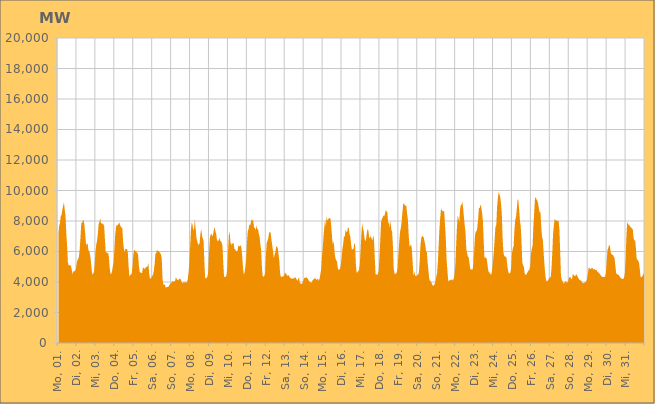
| Category | Series 0 |
|---|---|
|  Mo, 01.  | 7160.8 |
|  Mo, 01.  | 7705.218 |
|  Mo, 01.  | 7864.699 |
|  Mo, 01.  | 8328.516 |
|  Mo, 01.  | 8390.173 |
|  Mo, 01.  | 8753.918 |
|  Mo, 01.  | 8996.663 |
|  Mo, 01.  | 9224.132 |
|  Mo, 01.  | 8751.63 |
|  Mo, 01.  | 8347.011 |
|  Mo, 01.  | 7218.068 |
|  Mo, 01.  | 6396.392 |
|  Mo, 01.  | 5312.818 |
|  Mo, 01.  | 5092.311 |
|  Mo, 01.  | 5100.674 |
|  Mo, 01.  | 5104.183 |
|  Mo, 01.  | 5050.026 |
|  Di, 02.  | 4777.491 |
|  Di, 02.  | 4504.343 |
|  Di, 02.  | 4703.73 |
|  Di, 02.  | 4683.091 |
|  Di, 02.  | 4751.146 |
|  Di, 02.  | 4800.699 |
|  Di, 02.  | 5169.973 |
|  Di, 02.  | 5424.805 |
|  Di, 02.  | 5495.186 |
|  Di, 02.  | 5653.998 |
|  Di, 02.  | 6155.003 |
|  Di, 02.  | 6919.252 |
|  Di, 02.  | 7878.823 |
|  Di, 02.  | 7863.462 |
|  Di, 02.  | 8044.74 |
|  Di, 02.  | 8046.723 |
|  Di, 02.  | 7725.12 |
|  Di, 02.  | 7157.747 |
|  Di, 02.  | 6465.687 |
|  Di, 02.  | 6462.276 |
|  Di, 02.  | 6552.212 |
|  Di, 02.  | 6120.136 |
|  Di, 02.  | 6020.143 |
|  Di, 02.  | 5851.743 |
|  Mi, 03.  | 5464.788 |
|  Mi, 03.  | 4869.98 |
|  Mi, 03.  | 4470.95 |
|  Mi, 03.  | 4552.139 |
|  Mi, 03.  | 4636.698 |
|  Mi, 03.  | 5122.081 |
|  Mi, 03.  | 6000.724 |
|  Mi, 03.  | 6456.434 |
|  Mi, 03.  | 6697.356 |
|  Mi, 03.  | 7150.811 |
|  Mi, 03.  | 7785.971 |
|  Mi, 03.  | 7944.531 |
|  Mi, 03.  | 8176.038 |
|  Mi, 03.  | 7851.384 |
|  Mi, 03.  | 7831.848 |
|  Mi, 03.  | 7835.501 |
|  Mi, 03.  | 7790.822 |
|  Mi, 03.  | 7666.782 |
|  Mi, 03.  | 6763.971 |
|  Mi, 03.  | 5929.706 |
|  Mi, 03.  | 5962.51 |
|  Mi, 03.  | 5880.363 |
|  Mi, 03.  | 5910.435 |
|  Mi, 03.  | 5634.178 |
|  Do, 04.  | 4930.859 |
|  Do, 04.  | 4541.599 |
|  Do, 04.  | 4517.017 |
|  Do, 04.  | 4700.879 |
|  Do, 04.  | 5041.495 |
|  Do, 04.  | 5295.906 |
|  Do, 04.  | 6176.422 |
|  Do, 04.  | 7097.032 |
|  Do, 04.  | 7595.268 |
|  Do, 04.  | 7761.839 |
|  Do, 04.  | 7701.492 |
|  Do, 04.  | 7794.035 |
|  Do, 04.  | 7913.431 |
|  Do, 04.  | 7751.925 |
|  Do, 04.  | 7645.281 |
|  Do, 04.  | 7557.731 |
|  Do, 04.  | 7570.642 |
|  Do, 04.  | 6646.405 |
|  Do, 04.  | 6188.732 |
|  Do, 04.  | 5933.102 |
|  Do, 04.  | 6183.347 |
|  Do, 04.  | 6147.994 |
|  Do, 04.  | 6172.458 |
|  Do, 04.  | 5937.749 |
|  Fr, 05.  | 4988.127 |
|  Fr, 05.  | 4360.904 |
|  Fr, 05.  | 4465.97 |
|  Fr, 05.  | 4481.926 |
|  Fr, 05.  | 4576.888 |
|  Fr, 05.  | 5017.709 |
|  Fr, 05.  | 5780.562 |
|  Fr, 05.  | 6108.178 |
|  Fr, 05.  | 6061.314 |
|  Fr, 05.  | 6012.59 |
|  Fr, 05.  | 5953.136 |
|  Fr, 05.  | 5906.494 |
|  Fr, 05.  | 5795.051 |
|  Fr, 05.  | 5092.796 |
|  Fr, 05.  | 4671.377 |
|  Fr, 05.  | 4619.644 |
|  Fr, 05.  | 4610.367 |
|  Fr, 05.  | 4565.465 |
|  Fr, 05.  | 4901.234 |
|  Fr, 05.  | 4954.916 |
|  Fr, 05.  | 4870.929 |
|  Fr, 05.  | 4875.349 |
|  Fr, 05.  | 4973.858 |
|  Fr, 05.  | 4985.63 |
|  Sa, 06.  | 5033.617 |
|  Sa, 06.  | 5246.087 |
|  Sa, 06.  | 4592.596 |
|  Sa, 06.  | 4229.398 |
|  Sa, 06.  | 4229.584 |
|  Sa, 06.  | 4299.787 |
|  Sa, 06.  | 4399.803 |
|  Sa, 06.  | 4488.37 |
|  Sa, 06.  | 4751.216 |
|  Sa, 06.  | 5198.847 |
|  Sa, 06.  | 5871.813 |
|  Sa, 06.  | 5891.169 |
|  Sa, 06.  | 6134.83 |
|  Sa, 06.  | 6011.156 |
|  Sa, 06.  | 6014.912 |
|  Sa, 06.  | 5979.808 |
|  Sa, 06.  | 5873.295 |
|  Sa, 06.  | 5823.883 |
|  Sa, 06.  | 5523.351 |
|  Sa, 06.  | 4207.687 |
|  Sa, 06.  | 3823.684 |
|  Sa, 06.  | 3838.857 |
|  Sa, 06.  | 3818.794 |
|  Sa, 06.  | 3625.022 |
|  So, 07.  | 3658.255 |
|  So, 07.  | 3669.756 |
|  So, 07.  | 3668.924 |
|  So, 07.  | 3726.962 |
|  So, 07.  | 3833.741 |
|  So, 07.  | 3889.55 |
|  So, 07.  | 3947.685 |
|  So, 07.  | 3994.545 |
|  So, 07.  | 4077.124 |
|  So, 07.  | 4025.181 |
|  So, 07.  | 4017.348 |
|  So, 07.  | 4094.382 |
|  So, 07.  | 4326.647 |
|  So, 07.  | 4192.877 |
|  So, 07.  | 4140.207 |
|  So, 07.  | 4104.201 |
|  So, 07.  | 4232.823 |
|  So, 07.  | 4202.677 |
|  So, 07.  | 4177.596 |
|  So, 07.  | 4049.653 |
|  So, 07.  | 3909.823 |
|  So, 07.  | 3979.445 |
|  So, 07.  | 3973.53 |
|  So, 07.  | 3980.216 |
|  Mo, 08.  | 3975.462 |
|  Mo, 08.  | 3952.562 |
|  Mo, 08.  | 4001.577 |
|  Mo, 08.  | 4192.479 |
|  Mo, 08.  | 4620.058 |
|  Mo, 08.  | 5312.887 |
|  Mo, 08.  | 6309.76 |
|  Mo, 08.  | 7429.641 |
|  Mo, 08.  | 7911.313 |
|  Mo, 08.  | 7761.518 |
|  Mo, 08.  | 7375.69 |
|  Mo, 08.  | 7550.807 |
|  Mo, 08.  | 8101.582 |
|  Mo, 08.  | 7475.265 |
|  Mo, 08.  | 6879.427 |
|  Mo, 08.  | 6673.732 |
|  Mo, 08.  | 6488.745 |
|  Mo, 08.  | 6434.608 |
|  Mo, 08.  | 6575.351 |
|  Mo, 08.  | 7169.19 |
|  Mo, 08.  | 7463.065 |
|  Mo, 08.  | 7049.424 |
|  Mo, 08.  | 6838.778 |
|  Mo, 08.  | 6739.852 |
|  Di, 09.  | 5309.416 |
|  Di, 09.  | 4275.985 |
|  Di, 09.  | 4215.956 |
|  Di, 09.  | 4292.653 |
|  Di, 09.  | 4362.668 |
|  Di, 09.  | 4747.168 |
|  Di, 09.  | 6010.226 |
|  Di, 09.  | 6872.619 |
|  Di, 09.  | 7128.411 |
|  Di, 09.  | 7162.15 |
|  Di, 09.  | 6986.376 |
|  Di, 09.  | 7110.528 |
|  Di, 09.  | 7395.117 |
|  Di, 09.  | 7593.925 |
|  Di, 09.  | 7336.824 |
|  Di, 09.  | 7141.814 |
|  Di, 09.  | 6751.124 |
|  Di, 09.  | 6680.317 |
|  Di, 09.  | 6712.713 |
|  Di, 09.  | 6917.112 |
|  Di, 09.  | 6711.591 |
|  Di, 09.  | 6662.535 |
|  Di, 09.  | 6582.888 |
|  Di, 09.  | 6354.857 |
|  Mi, 10.  | 5212.211 |
|  Mi, 10.  | 4318.948 |
|  Mi, 10.  | 4352.289 |
|  Mi, 10.  | 4347.541 |
|  Mi, 10.  | 4414.83 |
|  Mi, 10.  | 4894.443 |
|  Mi, 10.  | 5985.324 |
|  Mi, 10.  | 7042.466 |
|  Mi, 10.  | 7315.863 |
|  Mi, 10.  | 6634.918 |
|  Mi, 10.  | 6387.175 |
|  Mi, 10.  | 6581.41 |
|  Mi, 10.  | 6483.927 |
|  Mi, 10.  | 6586.209 |
|  Mi, 10.  | 6186.66 |
|  Mi, 10.  | 6143.909 |
|  Mi, 10.  | 6038.358 |
|  Mi, 10.  | 5996.383 |
|  Mi, 10.  | 6038.663 |
|  Mi, 10.  | 6409.104 |
|  Mi, 10.  | 6321.779 |
|  Mi, 10.  | 6364.27 |
|  Mi, 10.  | 6407.552 |
|  Mi, 10.  | 6238.225 |
|  Do, 11.  | 5678.478 |
|  Do, 11.  | 4939.174 |
|  Do, 11.  | 4486.344 |
|  Do, 11.  | 4616.661 |
|  Do, 11.  | 4985.549 |
|  Do, 11.  | 5569.904 |
|  Do, 11.  | 6553.877 |
|  Do, 11.  | 7331.064 |
|  Do, 11.  | 7452.473 |
|  Do, 11.  | 7778.124 |
|  Do, 11.  | 7712.094 |
|  Do, 11.  | 7911.382 |
|  Do, 11.  | 8116.081 |
|  Do, 11.  | 8059.647 |
|  Do, 11.  | 8019.377 |
|  Do, 11.  | 7557.197 |
|  Do, 11.  | 7551.771 |
|  Do, 11.  | 7395.552 |
|  Do, 11.  | 7725.649 |
|  Do, 11.  | 7439.542 |
|  Do, 11.  | 7522.095 |
|  Do, 11.  | 7161.052 |
|  Do, 11.  | 6971.345 |
|  Do, 11.  | 6452.594 |
|  Fr, 12.  | 6098.247 |
|  Fr, 12.  | 4928.394 |
|  Fr, 12.  | 4367.582 |
|  Fr, 12.  | 4352.858 |
|  Fr, 12.  | 4395.655 |
|  Fr, 12.  | 4605.897 |
|  Fr, 12.  | 5732.389 |
|  Fr, 12.  | 6563.914 |
|  Fr, 12.  | 6703.312 |
|  Fr, 12.  | 6860.232 |
|  Fr, 12.  | 7198.927 |
|  Fr, 12.  | 7319.134 |
|  Fr, 12.  | 7218.802 |
|  Fr, 12.  | 6775.13 |
|  Fr, 12.  | 6416.905 |
|  Fr, 12.  | 6042.671 |
|  Fr, 12.  | 5567.392 |
|  Fr, 12.  | 5786.575 |
|  Fr, 12.  | 5942.776 |
|  Fr, 12.  | 6324.396 |
|  Fr, 12.  | 6333.633 |
|  Fr, 12.  | 6214.995 |
|  Fr, 12.  | 5822.454 |
|  Fr, 12.  | 5395.099 |
|  Sa, 13.  | 4585.87 |
|  Sa, 13.  | 4335.458 |
|  Sa, 13.  | 4348.648 |
|  Sa, 13.  | 4360.104 |
|  Sa, 13.  | 4361.477 |
|  Sa, 13.  | 4412.052 |
|  Sa, 13.  | 4605.565 |
|  Sa, 13.  | 4568.092 |
|  Sa, 13.  | 4524.814 |
|  Sa, 13.  | 4371.555 |
|  Sa, 13.  | 4490.72 |
|  Sa, 13.  | 4418.519 |
|  Sa, 13.  | 4328.934 |
|  Sa, 13.  | 4264.462 |
|  Sa, 13.  | 4227.888 |
|  Sa, 13.  | 4227.896 |
|  Sa, 13.  | 4214.992 |
|  Sa, 13.  | 4246.714 |
|  Sa, 13.  | 4232.562 |
|  Sa, 13.  | 4326.769 |
|  Sa, 13.  | 4256.079 |
|  Sa, 13.  | 4166.355 |
|  Sa, 13.  | 4075.748 |
|  Sa, 13.  | 4206.025 |
|  So, 14.  | 4320.998 |
|  So, 14.  | 3912.711 |
|  So, 14.  | 3916.619 |
|  So, 14.  | 3869.18 |
|  So, 14.  | 3885.857 |
|  So, 14.  | 4032.226 |
|  So, 14.  | 4192.672 |
|  So, 14.  | 4275.719 |
|  So, 14.  | 4270.021 |
|  So, 14.  | 4308.577 |
|  So, 14.  | 4286.086 |
|  So, 14.  | 4202.992 |
|  So, 14.  | 4136.777 |
|  So, 14.  | 4031.028 |
|  So, 14.  | 4001.459 |
|  So, 14.  | 3962.437 |
|  So, 14.  | 3961.829 |
|  So, 14.  | 4093.948 |
|  So, 14.  | 4155.546 |
|  So, 14.  | 4192.963 |
|  So, 14.  | 4265.455 |
|  So, 14.  | 4209.593 |
|  So, 14.  | 4140.869 |
|  So, 14.  | 4178.077 |
|  Mo, 15.  | 4215.054 |
|  Mo, 15.  | 4082.978 |
|  Mo, 15.  | 4211.104 |
|  Mo, 15.  | 4508.053 |
|  Mo, 15.  | 4826.199 |
|  Mo, 15.  | 5677.585 |
|  Mo, 15.  | 6200.498 |
|  Mo, 15.  | 6949.018 |
|  Mo, 15.  | 7573.647 |
|  Mo, 15.  | 8103.706 |
|  Mo, 15.  | 7645.308 |
|  Mo, 15.  | 8300.122 |
|  Mo, 15.  | 8041.005 |
|  Mo, 15.  | 8104.88 |
|  Mo, 15.  | 8196.719 |
|  Mo, 15.  | 8189.322 |
|  Mo, 15.  | 8132.924 |
|  Mo, 15.  | 7562.423 |
|  Mo, 15.  | 6815.567 |
|  Mo, 15.  | 6430.644 |
|  Mo, 15.  | 6699.538 |
|  Mo, 15.  | 5963.449 |
|  Mo, 15.  | 5595.028 |
|  Mo, 15.  | 5431.043 |
|  Di, 16.  | 5362.591 |
|  Di, 16.  | 4948.988 |
|  Di, 16.  | 4792.878 |
|  Di, 16.  | 4798.367 |
|  Di, 16.  | 4877.418 |
|  Di, 16.  | 5155.493 |
|  Di, 16.  | 5576.57 |
|  Di, 16.  | 6182.215 |
|  Di, 16.  | 6512.719 |
|  Di, 16.  | 7025.106 |
|  Di, 16.  | 6943.917 |
|  Di, 16.  | 7437.91 |
|  Di, 16.  | 7301.562 |
|  Di, 16.  | 7272.911 |
|  Di, 16.  | 7578.987 |
|  Di, 16.  | 7544.44 |
|  Di, 16.  | 7137.191 |
|  Di, 16.  | 6988.367 |
|  Di, 16.  | 6464.423 |
|  Di, 16.  | 6130.749 |
|  Di, 16.  | 6148.115 |
|  Di, 16.  | 6138.44 |
|  Di, 16.  | 6546.124 |
|  Di, 16.  | 6481.737 |
|  Mi, 17.  | 5211.827 |
|  Mi, 17.  | 4600.015 |
|  Mi, 17.  | 4649.496 |
|  Mi, 17.  | 4705.835 |
|  Mi, 17.  | 4794.142 |
|  Mi, 17.  | 5114.392 |
|  Mi, 17.  | 6055.257 |
|  Mi, 17.  | 7086.213 |
|  Mi, 17.  | 7858.074 |
|  Mi, 17.  | 7526.629 |
|  Mi, 17.  | 7336.363 |
|  Mi, 17.  | 6859.058 |
|  Mi, 17.  | 6654.554 |
|  Mi, 17.  | 6806.201 |
|  Mi, 17.  | 7256.578 |
|  Mi, 17.  | 7480.425 |
|  Mi, 17.  | 7344.464 |
|  Mi, 17.  | 6875.962 |
|  Mi, 17.  | 6905.876 |
|  Mi, 17.  | 7040.421 |
|  Mi, 17.  | 6821.933 |
|  Mi, 17.  | 6723.819 |
|  Mi, 17.  | 7049.082 |
|  Mi, 17.  | 6820.25 |
|  Do, 18.  | 5563.418 |
|  Do, 18.  | 4516.212 |
|  Do, 18.  | 4499.607 |
|  Do, 18.  | 4463.201 |
|  Do, 18.  | 4542.612 |
|  Do, 18.  | 4759.906 |
|  Do, 18.  | 5652.83 |
|  Do, 18.  | 6785.527 |
|  Do, 18.  | 7935.247 |
|  Do, 18.  | 8124.386 |
|  Do, 18.  | 8237.584 |
|  Do, 18.  | 8371.242 |
|  Do, 18.  | 8301.173 |
|  Do, 18.  | 8506.185 |
|  Do, 18.  | 8719.286 |
|  Do, 18.  | 8620.096 |
|  Do, 18.  | 8578.305 |
|  Do, 18.  | 7779.26 |
|  Do, 18.  | 7989.325 |
|  Do, 18.  | 7530.381 |
|  Do, 18.  | 8023.606 |
|  Do, 18.  | 7437.495 |
|  Do, 18.  | 7300.115 |
|  Do, 18.  | 6347.056 |
|  Fr, 19.  | 4868.461 |
|  Fr, 19.  | 4561.302 |
|  Fr, 19.  | 4508.758 |
|  Fr, 19.  | 4541.535 |
|  Fr, 19.  | 4651.283 |
|  Fr, 19.  | 4960.966 |
|  Fr, 19.  | 5865.576 |
|  Fr, 19.  | 6625.546 |
|  Fr, 19.  | 7282.585 |
|  Fr, 19.  | 7539.443 |
|  Fr, 19.  | 7927.691 |
|  Fr, 19.  | 8540.51 |
|  Fr, 19.  | 9090.552 |
|  Fr, 19.  | 9180.535 |
|  Fr, 19.  | 9025.452 |
|  Fr, 19.  | 9012.91 |
|  Fr, 19.  | 8973.731 |
|  Fr, 19.  | 8468.399 |
|  Fr, 19.  | 8066.463 |
|  Fr, 19.  | 7081.638 |
|  Fr, 19.  | 6311.709 |
|  Fr, 19.  | 6378.722 |
|  Fr, 19.  | 6482.381 |
|  Fr, 19.  | 6149.943 |
|  Sa, 20.  | 5292.29 |
|  Sa, 20.  | 4398.727 |
|  Sa, 20.  | 4676.804 |
|  Sa, 20.  | 4463.127 |
|  Sa, 20.  | 4371.954 |
|  Sa, 20.  | 4388.974 |
|  Sa, 20.  | 4465.704 |
|  Sa, 20.  | 4473.273 |
|  Sa, 20.  | 4636.656 |
|  Sa, 20.  | 5455.432 |
|  Sa, 20.  | 6500.528 |
|  Sa, 20.  | 6876.181 |
|  Sa, 20.  | 7040.547 |
|  Sa, 20.  | 6974.064 |
|  Sa, 20.  | 6938.793 |
|  Sa, 20.  | 6669.769 |
|  Sa, 20.  | 6441.555 |
|  Sa, 20.  | 5987.808 |
|  Sa, 20.  | 5971.031 |
|  Sa, 20.  | 5277.205 |
|  Sa, 20.  | 4768.933 |
|  Sa, 20.  | 4197.201 |
|  Sa, 20.  | 4082.464 |
|  Sa, 20.  | 4030.803 |
|  So, 21.  | 3942.199 |
|  So, 21.  | 3807.881 |
|  So, 21.  | 3746.136 |
|  So, 21.  | 3790.441 |
|  So, 21.  | 3878.605 |
|  So, 21.  | 4056.882 |
|  So, 21.  | 4347.4 |
|  So, 21.  | 4585.754 |
|  So, 21.  | 5349.194 |
|  So, 21.  | 6427.62 |
|  So, 21.  | 7539.536 |
|  So, 21.  | 8239.715 |
|  So, 21.  | 8823.966 |
|  So, 21.  | 8704.238 |
|  So, 21.  | 8645.056 |
|  So, 21.  | 8654.894 |
|  So, 21.  | 8621.313 |
|  So, 21.  | 7758.486 |
|  So, 21.  | 6878.914 |
|  So, 21.  | 5500.284 |
|  So, 21.  | 4776.17 |
|  So, 21.  | 4139.242 |
|  So, 21.  | 4018.17 |
|  So, 21.  | 4119.638 |
|  Mo, 22.  | 4138.452 |
|  Mo, 22.  | 4134.599 |
|  Mo, 22.  | 4187.487 |
|  Mo, 22.  | 4076.793 |
|  Mo, 22.  | 4212.051 |
|  Mo, 22.  | 4475.846 |
|  Mo, 22.  | 5026.713 |
|  Mo, 22.  | 6219.034 |
|  Mo, 22.  | 7435.846 |
|  Mo, 22.  | 8316.531 |
|  Mo, 22.  | 8217.617 |
|  Mo, 22.  | 7916.777 |
|  Mo, 22.  | 8691.771 |
|  Mo, 22.  | 9040.911 |
|  Mo, 22.  | 9069.226 |
|  Mo, 22.  | 9261.955 |
|  Mo, 22.  | 8843.47 |
|  Mo, 22.  | 8253.871 |
|  Mo, 22.  | 7709.99 |
|  Mo, 22.  | 7278.463 |
|  Mo, 22.  | 6185.423 |
|  Mo, 22.  | 5874.856 |
|  Mo, 22.  | 5675.357 |
|  Mo, 22.  | 5621.787 |
|  Di, 23.  | 5252.877 |
|  Di, 23.  | 4858.763 |
|  Di, 23.  | 4817.873 |
|  Di, 23.  | 4815.362 |
|  Di, 23.  | 4822.172 |
|  Di, 23.  | 5206.875 |
|  Di, 23.  | 6063.493 |
|  Di, 23.  | 7041.484 |
|  Di, 23.  | 7300.89 |
|  Di, 23.  | 7322.907 |
|  Di, 23.  | 7587.876 |
|  Di, 23.  | 8125.929 |
|  Di, 23.  | 8862.984 |
|  Di, 23.  | 8844.649 |
|  Di, 23.  | 9075.928 |
|  Di, 23.  | 8913.657 |
|  Di, 23.  | 8534.375 |
|  Di, 23.  | 8029.427 |
|  Di, 23.  | 6770.636 |
|  Di, 23.  | 5583.033 |
|  Di, 23.  | 5594.322 |
|  Di, 23.  | 5613.94 |
|  Di, 23.  | 5489.226 |
|  Di, 23.  | 5056.18 |
|  Mi, 24.  | 4702.673 |
|  Mi, 24.  | 4636.539 |
|  Mi, 24.  | 4551.055 |
|  Mi, 24.  | 4496.52 |
|  Mi, 24.  | 4510.786 |
|  Mi, 24.  | 4903.762 |
|  Mi, 24.  | 5455.482 |
|  Mi, 24.  | 6064.787 |
|  Mi, 24.  | 6856.741 |
|  Mi, 24.  | 7654.946 |
|  Mi, 24.  | 7693.344 |
|  Mi, 24.  | 8905.487 |
|  Mi, 24.  | 9484.893 |
|  Mi, 24.  | 9885.241 |
|  Mi, 24.  | 9768.291 |
|  Mi, 24.  | 9573.295 |
|  Mi, 24.  | 9133.405 |
|  Mi, 24.  | 8507.067 |
|  Mi, 24.  | 6926.606 |
|  Mi, 24.  | 5969.53 |
|  Mi, 24.  | 5718.175 |
|  Mi, 24.  | 5661.456 |
|  Mi, 24.  | 5666.157 |
|  Mi, 24.  | 5576.255 |
|  Do, 25.  | 5062.665 |
|  Do, 25.  | 4739.975 |
|  Do, 25.  | 4556.046 |
|  Do, 25.  | 4577.871 |
|  Do, 25.  | 4629.501 |
|  Do, 25.  | 5006.083 |
|  Do, 25.  | 5925.83 |
|  Do, 25.  | 6205.438 |
|  Do, 25.  | 6355.858 |
|  Do, 25.  | 7403.859 |
|  Do, 25.  | 8069.812 |
|  Do, 25.  | 8249.682 |
|  Do, 25.  | 8780.768 |
|  Do, 25.  | 9430.347 |
|  Do, 25.  | 9342.992 |
|  Do, 25.  | 8746.193 |
|  Do, 25.  | 8010.639 |
|  Do, 25.  | 7647.146 |
|  Do, 25.  | 6627.037 |
|  Do, 25.  | 5268.278 |
|  Do, 25.  | 5094.515 |
|  Do, 25.  | 4986.092 |
|  Do, 25.  | 4563.694 |
|  Do, 25.  | 4468.327 |
|  Fr, 26.  | 4482.504 |
|  Fr, 26.  | 4580.426 |
|  Fr, 26.  | 4670.487 |
|  Fr, 26.  | 4764.926 |
|  Fr, 26.  | 4802.963 |
|  Fr, 26.  | 5044.897 |
|  Fr, 26.  | 5836.627 |
|  Fr, 26.  | 6195.007 |
|  Fr, 26.  | 6352.713 |
|  Fr, 26.  | 7611.755 |
|  Fr, 26.  | 8506.262 |
|  Fr, 26.  | 9456.294 |
|  Fr, 26.  | 9577.388 |
|  Fr, 26.  | 9406.465 |
|  Fr, 26.  | 9349.907 |
|  Fr, 26.  | 9164.299 |
|  Fr, 26.  | 8812.498 |
|  Fr, 26.  | 8545.847 |
|  Fr, 26.  | 8620.7 |
|  Fr, 26.  | 7609.019 |
|  Fr, 26.  | 6976.568 |
|  Fr, 26.  | 6778.583 |
|  Fr, 26.  | 5943.491 |
|  Fr, 26.  | 5187.413 |
|  Sa, 27.  | 4559.673 |
|  Sa, 27.  | 4148.857 |
|  Sa, 27.  | 4027.348 |
|  Sa, 27.  | 4074.756 |
|  Sa, 27.  | 4149.271 |
|  Sa, 27.  | 4239.164 |
|  Sa, 27.  | 4330.18 |
|  Sa, 27.  | 4286.633 |
|  Sa, 27.  | 4904.687 |
|  Sa, 27.  | 5904.289 |
|  Sa, 27.  | 7172.491 |
|  Sa, 27.  | 7705.924 |
|  Sa, 27.  | 8143.613 |
|  Sa, 27.  | 8051.471 |
|  Sa, 27.  | 8040.541 |
|  Sa, 27.  | 8006.3 |
|  Sa, 27.  | 7997.529 |
|  Sa, 27.  | 8009.357 |
|  Sa, 27.  | 7449.779 |
|  Sa, 27.  | 6013.104 |
|  Sa, 27.  | 4397.727 |
|  Sa, 27.  | 4166.024 |
|  Sa, 27.  | 4050.714 |
|  Sa, 27.  | 3922.526 |
|  So, 28.  | 3914.216 |
|  So, 28.  | 4033.995 |
|  So, 28.  | 4046.953 |
|  So, 28.  | 3994.963 |
|  So, 28.  | 3950.549 |
|  So, 28.  | 4032.576 |
|  So, 28.  | 4258.989 |
|  So, 28.  | 4343.99 |
|  So, 28.  | 4303.065 |
|  So, 28.  | 4208.187 |
|  So, 28.  | 4182.841 |
|  So, 28.  | 4528.249 |
|  So, 28.  | 4462.599 |
|  So, 28.  | 4415.054 |
|  So, 28.  | 4382.819 |
|  So, 28.  | 4460.686 |
|  So, 28.  | 4495.033 |
|  So, 28.  | 4357.289 |
|  So, 28.  | 4268.582 |
|  So, 28.  | 4174.921 |
|  So, 28.  | 4103.515 |
|  So, 28.  | 4117.287 |
|  So, 28.  | 4047.136 |
|  So, 28.  | 3948.872 |
|  Mo, 29.  | 3908.303 |
|  Mo, 29.  | 3940.886 |
|  Mo, 29.  | 3964.969 |
|  Mo, 29.  | 3976.846 |
|  Mo, 29.  | 4054.975 |
|  Mo, 29.  | 4209.014 |
|  Mo, 29.  | 4519.623 |
|  Mo, 29.  | 4916.896 |
|  Mo, 29.  | 4934.05 |
|  Mo, 29.  | 4848.998 |
|  Mo, 29.  | 4856.46 |
|  Mo, 29.  | 4934.401 |
|  Mo, 29.  | 4922.348 |
|  Mo, 29.  | 4808.676 |
|  Mo, 29.  | 4857.559 |
|  Mo, 29.  | 4819.04 |
|  Mo, 29.  | 4781.187 |
|  Mo, 29.  | 4789.156 |
|  Mo, 29.  | 4683.716 |
|  Mo, 29.  | 4655.397 |
|  Mo, 29.  | 4592.353 |
|  Mo, 29.  | 4540.601 |
|  Mo, 29.  | 4462.127 |
|  Mo, 29.  | 4408.176 |
|  Di, 30.  | 4341.733 |
|  Di, 30.  | 4326.164 |
|  Di, 30.  | 4334.461 |
|  Di, 30.  | 4326.029 |
|  Di, 30.  | 4365.762 |
|  Di, 30.  | 4633.155 |
|  Di, 30.  | 5423.462 |
|  Di, 30.  | 6092.198 |
|  Di, 30.  | 6249.619 |
|  Di, 30.  | 6417.1 |
|  Di, 30.  | 6387.666 |
|  Di, 30.  | 5934.032 |
|  Di, 30.  | 5828.109 |
|  Di, 30.  | 5772.556 |
|  Di, 30.  | 5791.283 |
|  Di, 30.  | 5636.925 |
|  Di, 30.  | 5538.372 |
|  Di, 30.  | 5015.823 |
|  Di, 30.  | 4559.601 |
|  Di, 30.  | 4520.202 |
|  Di, 30.  | 4479.608 |
|  Di, 30.  | 4468.558 |
|  Di, 30.  | 4398.873 |
|  Di, 30.  | 4308.153 |
|  Mi, 31.  | 4237.257 |
|  Mi, 31.  | 4224.91 |
|  Mi, 31.  | 4186.382 |
|  Mi, 31.  | 4203.524 |
|  Mi, 31.  | 4315.382 |
|  Mi, 31.  | 4591.461 |
|  Mi, 31.  | 5595.711 |
|  Mi, 31.  | 7073.693 |
|  Mi, 31.  | 7937.116 |
|  Mi, 31.  | 7823.063 |
|  Mi, 31.  | 7725.602 |
|  Mi, 31.  | 7720.047 |
|  Mi, 31.  | 7595.207 |
|  Mi, 31.  | 7573.005 |
|  Mi, 31.  | 7496.685 |
|  Mi, 31.  | 7463.983 |
|  Mi, 31.  | 6904.574 |
|  Mi, 31.  | 6718.698 |
|  Mi, 31.  | 6734.582 |
|  Mi, 31.  | 6193.109 |
|  Mi, 31.  | 5489.597 |
|  Mi, 31.  | 5475.979 |
|  Mi, 31.  | 5376.332 |
|  Mi, 31.  | 5243.458 |
|  Do, 01.  | 4781.85 |
|  Do, 01.  | 4313.716 |
|  Do, 01.  | 4323.322 |
|  Do, 01.  | 4360.354 |
|  Do, 01.  | 4467.207 |
|  Do, 01.  | 4574.525 |